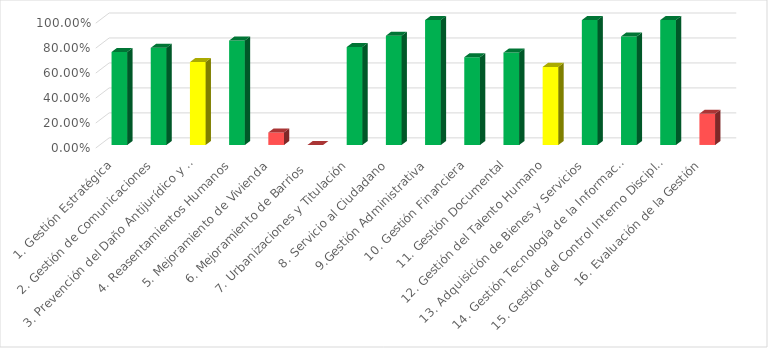
| Category | Calificación |
|---|---|
| 1. Gestión Estratégica | 0.744 |
| 2. Gestión de Comunicaciones | 0.778 |
| 3. Prevención del Daño Antijurídico y Representación Judicial | 0.664 |
| 4. Reasentamientos Humanos | 0.836 |
| 5. Mejoramiento de Vivienda | 0.1 |
| 6. Mejoramiento de Barrios  | 0 |
| 7. Urbanizaciones y Titulación | 0.784 |
| 8. Servicio al Ciudadano | 0.875 |
| 9.Gestión Administrativa | 1 |
| 10. Gestión Financiera | 0.703 |
| 11. Gestión Documental | 0.74 |
| 12. Gestión del Talento Humano | 0.625 |
| 13. Adquisición de Bienes y Servicios | 1 |
| 14. Gestión Tecnología de la Información y Comunicaciones  | 0.869 |
| 15. Gestión del Control Interno Disciplinario | 1 |
| 16. Evaluación de la Gestión | 0.25 |